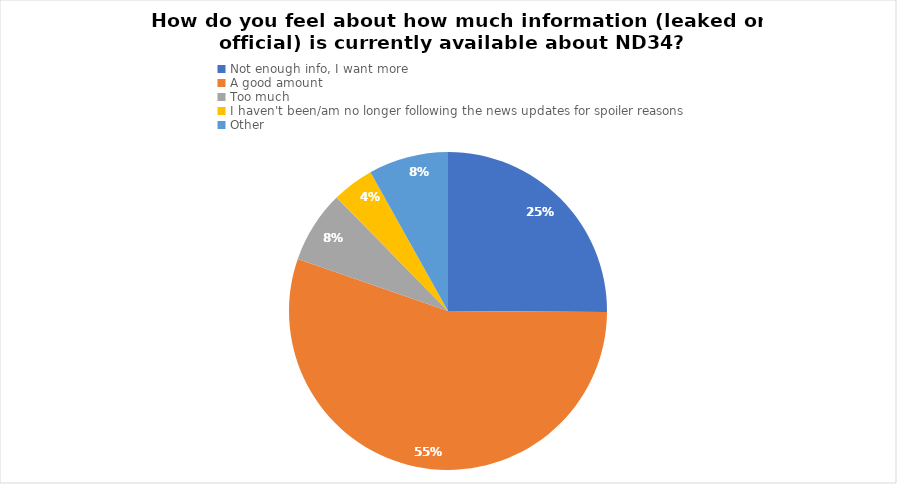
| Category | Series 0 |
|---|---|
| Not enough info, I want more | 65 |
| A good amount | 143 |
| Too much | 19 |
| I haven't been/am no longer following the news updates for spoiler reasons | 11 |
| Other | 21 |